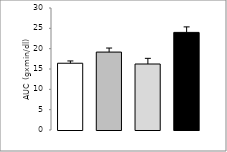
| Category | Series 0 |
|---|---|
| WT | 16.418 |
| WT_api | 19.158 |
| hepKO | 16.227 |
| hepKO_api | 24.002 |